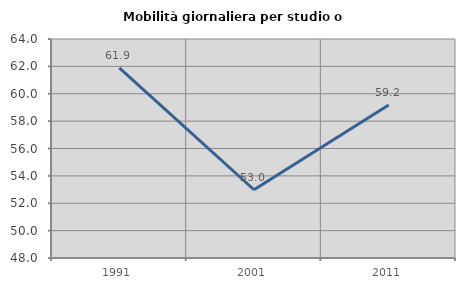
| Category | Mobilità giornaliera per studio o lavoro |
|---|---|
| 1991.0 | 61.895 |
| 2001.0 | 52.986 |
| 2011.0 | 59.185 |